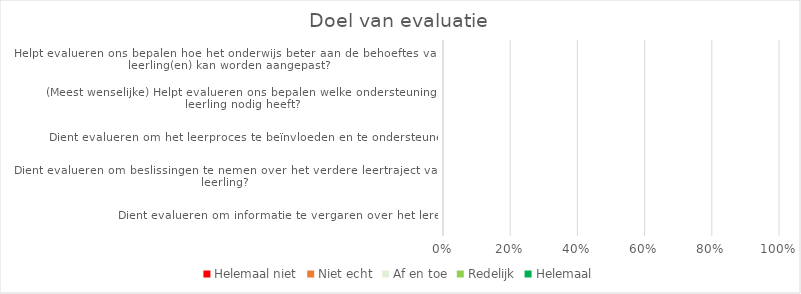
| Category | Helemaal niet | Niet echt | Af en toe | Redelijk | Helemaal |
|---|---|---|---|---|---|
| Dient evalueren om informatie te vergaren over het leren? | 0 | 0 | 0 | 0 | 0 |
| Dient evalueren om beslissingen te nemen over het verdere leertraject van de leerling? | 0 | 0 | 0 | 0 | 0 |
| Dient evalueren om het leerproces te beïnvloeden en te ondersteunen? | 0 | 0 | 0 | 0 | 0 |
| (Meest wenselijke) Helpt evalueren ons bepalen welke ondersteuning de leerling nodig heeft? | 0 | 0 | 0 | 0 | 0 |
| Helpt evalueren ons bepalen hoe het onderwijs beter aan de behoeftes van de leerling(en) kan worden aangepast? | 0 | 0 | 0 | 0 | 0 |